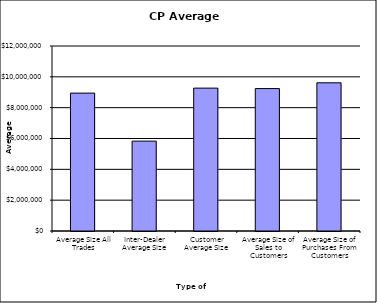
| Category | Security Type |
|---|---|
| Average Size All Trades | 8943852.542 |
| Inter-Dealer Average Size | 5828988.024 |
| Customer Average Size | 9268358.079 |
| Average Size of Sales to Customers | 9238690.379 |
| Average Size of Purchases From Customers | 9613157.48 |